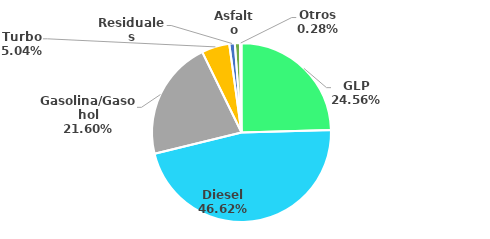
| Category | MBPD |
|---|---|
| GLP | 61.136 |
| Diesel | 116.065 |
| Gasolina/Gasohol | 53.773 |
| Turbo | 12.538 |
| Residuales | 2.471 |
| Asfalto | 2.292 |
| Otros | 0.689 |